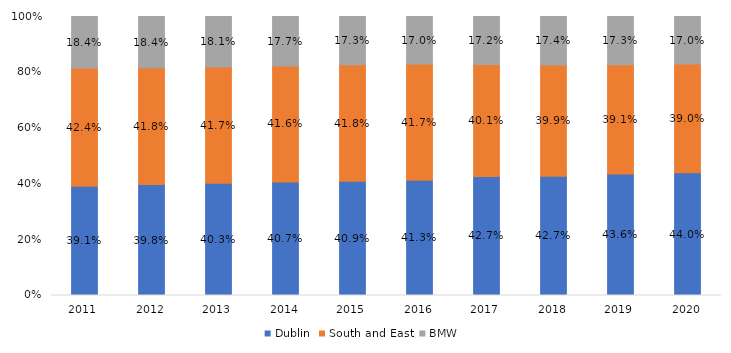
| Category | Dublin | South and East | BMW  |
|---|---|---|---|
| 2011.0 | 0.391 | 0.424 | 0.184 |
| 2012.0 | 0.398 | 0.418 | 0.184 |
| 2013.0 | 0.403 | 0.417 | 0.181 |
| 2014.0 | 0.407 | 0.416 | 0.177 |
| 2015.0 | 0.409 | 0.418 | 0.173 |
| 2016.0 | 0.413 | 0.417 | 0.17 |
| 2017.0 | 0.427 | 0.401 | 0.172 |
| 2018.0 | 0.427 | 0.399 | 0.174 |
| 2019.0 | 0.436 | 0.391 | 0.173 |
| 2020.0 | 0.44 | 0.39 | 0.17 |